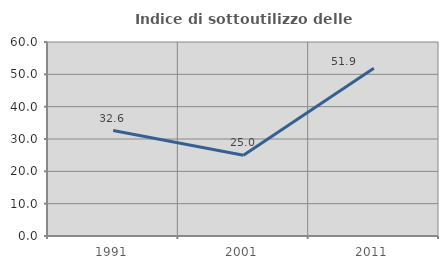
| Category | Indice di sottoutilizzo delle abitazioni  |
|---|---|
| 1991.0 | 32.618 |
| 2001.0 | 25 |
| 2011.0 | 51.915 |